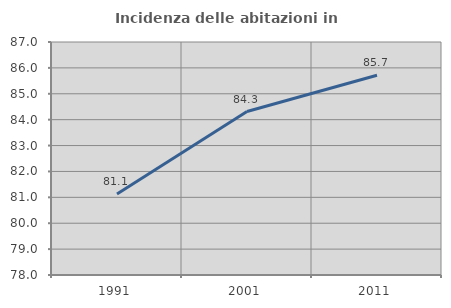
| Category | Incidenza delle abitazioni in proprietà  |
|---|---|
| 1991.0 | 81.132 |
| 2001.0 | 84.314 |
| 2011.0 | 85.714 |